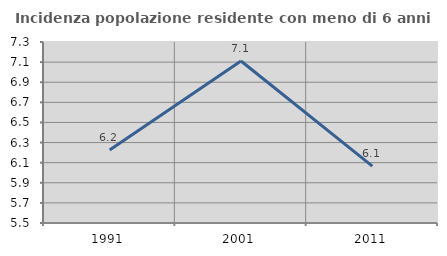
| Category | Incidenza popolazione residente con meno di 6 anni |
|---|---|
| 1991.0 | 6.225 |
| 2001.0 | 7.111 |
| 2011.0 | 6.066 |